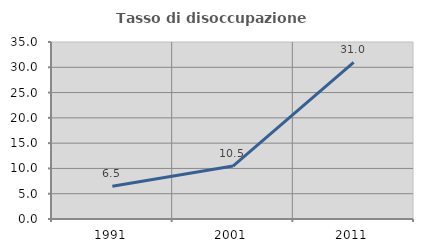
| Category | Tasso di disoccupazione giovanile  |
|---|---|
| 1991.0 | 6.486 |
| 2001.0 | 10.476 |
| 2011.0 | 30.986 |